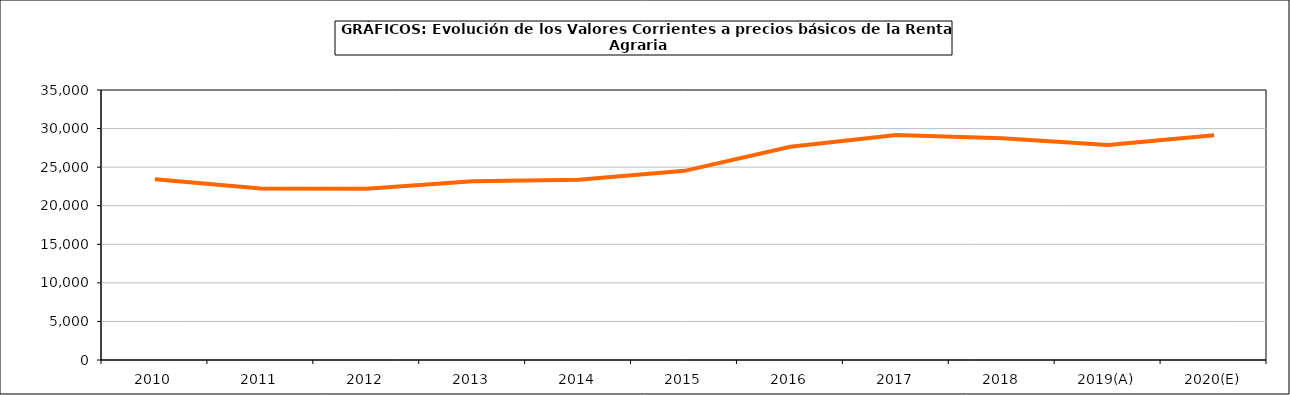
| Category | renta agraria |
|---|---|
| 2010 | 23433.2 |
| 2011 | 22219.2 |
| 2012 | 22193.5 |
| 2013 | 23161.5 |
| 2014 | 23361.1 |
| 2015 | 24518.8 |
| 2016 | 27646.8 |
| 2017 | 29152.2 |
| 2018 | 28755.3 |
| 2019(A) | 27883.6 |
| 2020(E) | 29123.6 |